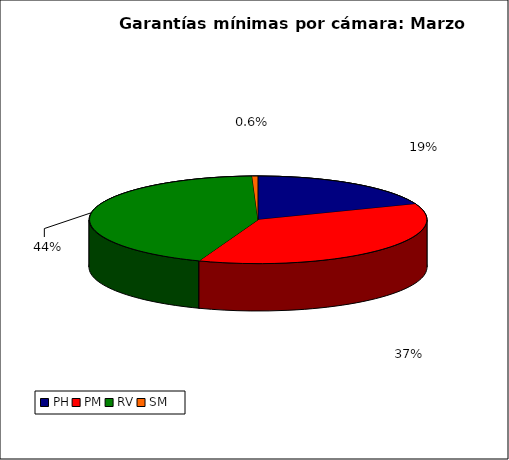
| Category | Series 0 |
|---|---|
| PH | 2156.051 |
| PM | 4109.049 |
| RV | 4924.302 |
| SM | 62.412 |